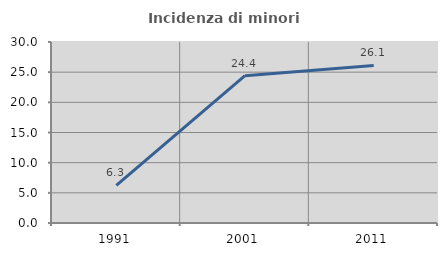
| Category | Incidenza di minori stranieri |
|---|---|
| 1991.0 | 6.25 |
| 2001.0 | 24.419 |
| 2011.0 | 26.107 |